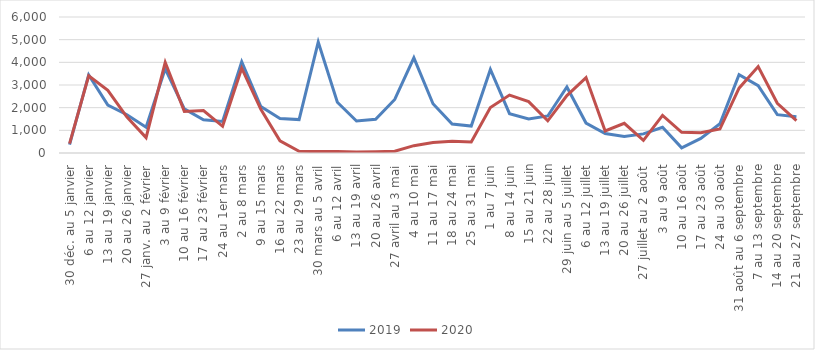
| Category | 2019 | 2020 |
|---|---|---|
| 30 déc. au 5 janvier | 369 | 411 |
| 6 au 12 janvier | 3446 | 3402 |
| 13 au 19 janvier | 2117 | 2765 |
| 20 au 26 janvier | 1689 | 1587 |
| 27 janv. au 2 février | 1140 | 678 |
| 3 au 9 février | 3711 | 4002 |
| 10 au 16 février | 1947 | 1835 |
| 17 au 23 février | 1464 | 1874 |
| 24 au 1er mars | 1389 | 1178 |
| 2 au 8 mars | 4019 | 3741 |
| 9 au 15 mars | 2049 | 1928 |
| 16 au 22 mars | 1525 | 536 |
| 23 au 29 mars | 1473 | 74 |
| 30 mars au 5 avril | 4896 | 61 |
| 6 au 12 avril | 2237 | 69 |
| 13 au 19 avril | 1410 | 40 |
| 20 au 26 avril | 1489 | 59 |
| 27 avril au 3 mai | 2361 | 79 |
| 4 au 10 mai | 4200 | 324 |
| 11 au 17 mai | 2172 | 463 |
| 18 au 24 mai | 1275 | 517 |
| 25 au 31 mai | 1190 | 488 |
| 1 au 7 juin | 3685 | 2004 |
| 8 au 14 juin | 1736 | 2554 |
| 15 au 21 juin | 1497 | 2268 |
| 22 au 28 juin | 1634 | 1420 |
| 29 juin au 5 juillet | 2913 | 2533 |
| 6 au 12 juillet | 1321 | 3326 |
| 13 au 19 juillet | 858 | 974 |
| 20 au 26 juillet | 730 | 1308 |
| 27 juillet au 2 août | 843 | 557 |
| 3 au 9 août | 1137 | 1658 |
| 10 au 16 août | 229 | 911 |
| 17 au 23 août | 641 | 890 |
| 24 au 30 août | 1291 | 1057 |
| 31 août au 6 septembre | 3457 | 2861 |
| 7 au 13 septembre | 2973 | 3814 |
| 14 au 20 septembre | 1692 | 2193 |
| 21 au 27 septembre | 1603 | 1428 |